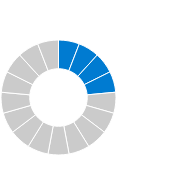
| Category | Corporate customers |
|---|---|
| 0 | 1 |
| 1 | 1 |
| 2 | 1 |
| 3 | 1 |
| 4 | 1 |
| 5 | 1 |
| 6 | 1 |
| 7 | 1 |
| 8 | 1 |
| 9 | 1 |
| 10 | 1 |
| 11 | 1 |
| 12 | 1 |
| 13 | 1 |
| 14 | 1 |
| 15 | 1 |
| 16 | 1 |